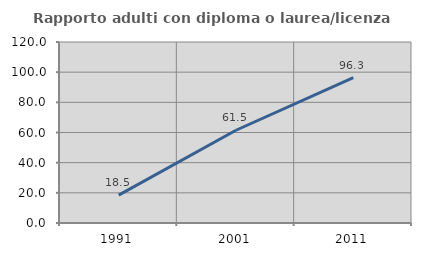
| Category | Rapporto adulti con diploma o laurea/licenza media  |
|---|---|
| 1991.0 | 18.452 |
| 2001.0 | 61.494 |
| 2011.0 | 96.319 |